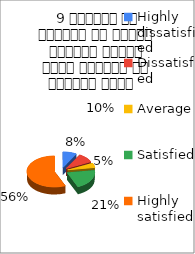
| Category |  9 शिक्षक ने शिक्षण के दौरान आधुनिक तकनीक पावर पॉइन्ट का प्रयोग किया   |
|---|---|
| Highly dissatisfied | 5 |
| Dissatisfied | 6 |
| Average | 3 |
| Satisfied | 13 |
| Highly satisfied | 35 |